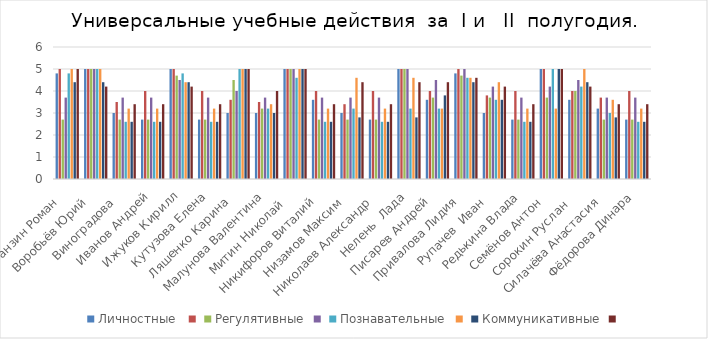
| Category | Личностные  | Series 1 | Регулятивные | Series 3 | Познавательные | Series 5 | Коммуникативные | Series 7 |
|---|---|---|---|---|---|---|---|---|
| Аранзин Роман   | 4.8 | 5 | 2.7 | 3.7 | 4.8 | 5 | 4.4 | 5 |
| Воробьёв Юрий   | 5 | 5 | 5 | 5 | 5 | 5 | 4.4 | 4.2 |
| Виноградова   | 3 | 3.5 | 2.7 | 3.7 | 2.6 | 3.2 | 2.6 | 3.4 |
| Иванов Андрей | 2.7 | 4 | 2.7 | 3.7 | 2.6 | 3.2 | 2.6 | 3.4 |
| Ижуков Кирилл | 5 | 5 | 4.7 | 4.5 | 4.8 | 4.4 | 4.4 | 4.2 |
| Кутузова Елена | 2.7 | 4 | 2.7 | 3.7 | 2.6 | 3.2 | 2.6 | 3.4 |
| Ляшенко Карина   | 3 | 3.6 | 4.5 | 4 | 5 | 5 | 5 | 5 |
| Малунова Валентина | 3 | 3.5 | 3.2 | 3.7 | 3.2 | 3.4 | 3 | 4 |
| Митин Николай    | 5 | 5 | 5 | 5 | 4.6 | 5 | 5 | 5 |
| Никифоров Виталий   | 3.6 | 4 | 2.7 | 3.7 | 2.6 | 3.2 | 2.6 | 3.4 |
| Низамов Максим   | 3 | 3.4 | 2.7 | 3.7 | 3.2 | 4.6 | 2.8 | 4.4 |
| Николаев Александр   | 2.7 | 4 | 2.7 | 3.7 | 2.6 | 3.2 | 2.6 | 3.4 |
| Нелень  Лада | 5 | 5 | 5 | 5 | 3.2 | 4.6 | 2.8 | 4.4 |
| Писарев Андрей   | 3.6 | 4 | 3.7 | 4.5 | 3.2 | 3.2 | 3.8 | 4.4 |
| Привалова Лидия   | 4.8 | 5 | 4.7 | 5 | 4.6 | 4.6 | 4.4 | 4.6 |
| Рупачев  Иван   | 3 | 3.8 | 3.7 | 4.2 | 3.6 | 4.4 | 3.6 | 4.2 |
| Редькина Влада | 2.7 | 4 | 2.7 | 3.7 | 2.6 | 3.2 | 2.6 | 3.4 |
| Семёнов Антон   | 5 | 5 | 3.7 | 4.2 | 5 | 3.2 | 5 | 5 |
| Сорокин Руслан    | 3.6 | 4 | 4 | 4.5 | 4.2 | 5 | 4.4 | 4.2 |
| Силачёва Анастасия   | 3.2 | 3.7 | 2.7 | 3.7 | 3 | 3.6 | 2.8 | 3.4 |
| Фёдорова Динара | 2.7 | 4 | 2.7 | 3.7 | 2.6 | 3.2 | 2.6 | 3.4 |